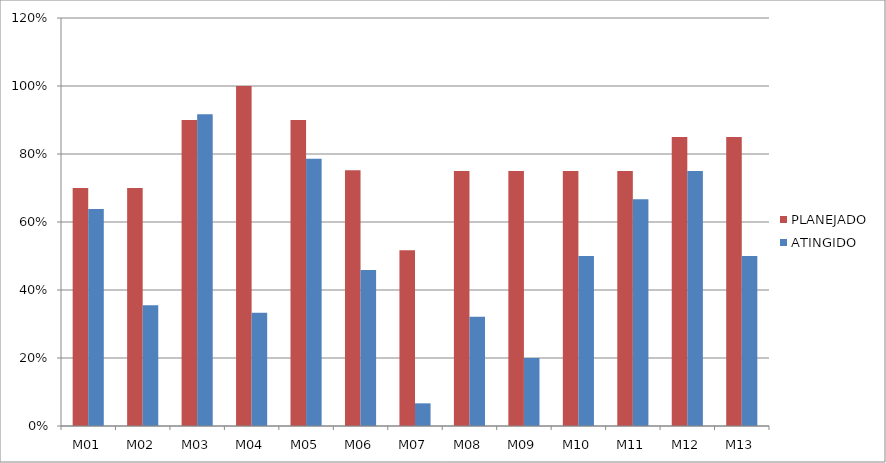
| Category | PLANEJADO | ATINGIDO |
|---|---|---|
| M01 | 0.7 | 0.639 |
| M02 | 0.7 | 0.355 |
| M03 | 0.9 | 0.917 |
| M04 | 1 | 0.333 |
| M05 | 0.9 | 0.786 |
| M06 | 0.752 | 0.459 |
| M07 | 0.517 | 0.067 |
| M08 | 0.75 | 0.321 |
| M09 | 0.75 | 0.2 |
| M10 | 0.75 | 0.5 |
| M11 | 0.75 | 0.667 |
| M12 | 0.85 | 0.75 |
| M13 | 0.85 | 0.5 |